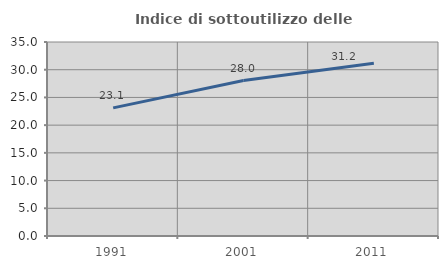
| Category | Indice di sottoutilizzo delle abitazioni  |
|---|---|
| 1991.0 | 23.113 |
| 2001.0 | 28.044 |
| 2011.0 | 31.184 |